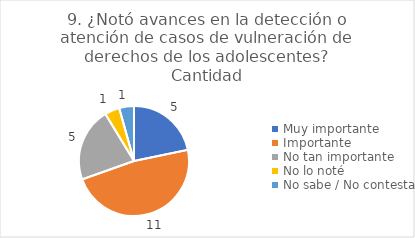
| Category | 9. ¿Notó avances en la detección o atención de casos de vulneración de derechos de los adolescentes? |
|---|---|
| Muy importante  | 0.217 |
| Importante  | 0.478 |
| No tan importante  | 0.217 |
| No lo noté  | 0.043 |
| No sabe / No contesta | 0.043 |